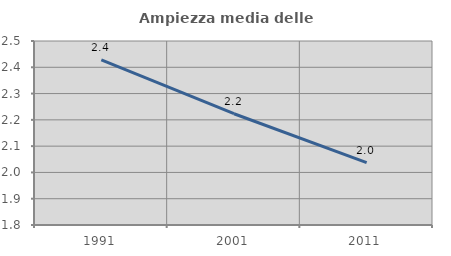
| Category | Ampiezza media delle famiglie |
|---|---|
| 1991.0 | 2.428 |
| 2001.0 | 2.223 |
| 2011.0 | 2.038 |